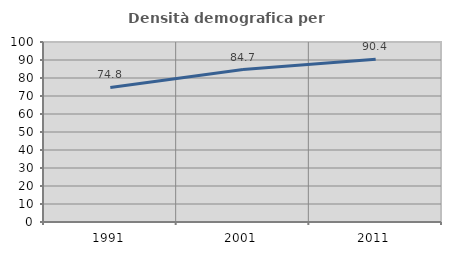
| Category | Densità demografica |
|---|---|
| 1991.0 | 74.781 |
| 2001.0 | 84.67 |
| 2011.0 | 90.433 |